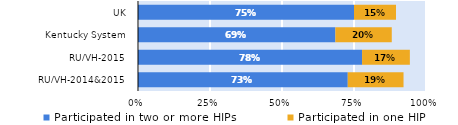
| Category | Participated in two or more HIPs | Participated in one HIP |
|---|---|---|
| RU/VH-2014&2015 | 0.728 | 0.194 |
| RU/VH-2015 | 0.778 | 0.166 |
| Kentucky System | 0.685 | 0.196 |
| UK | 0.75 | 0.146 |